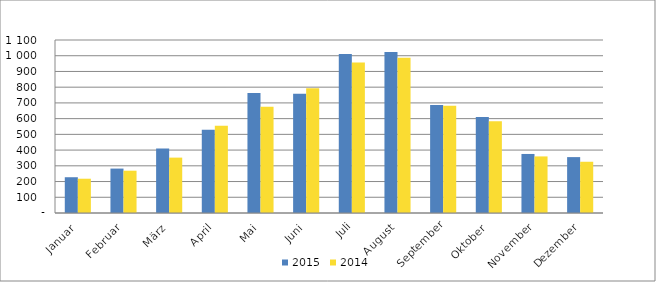
| Category | 2015 | 2014 |
|---|---|---|
| Januar | 227436 | 217950 |
| Februar | 282437 | 268924 |
| März | 409915 | 352130 |
| April | 529705 | 554438 |
| Mai | 763430 | 675751 |
| Juni | 758053 | 793958 |
| Juli | 1010376 | 956327 |
| August | 1023026 | 986838 |
| September | 686411 | 682377 |
| Oktober | 609720 | 583771 |
| November | 375409 | 359782 |
| Dezember | 355398 | 325825 |